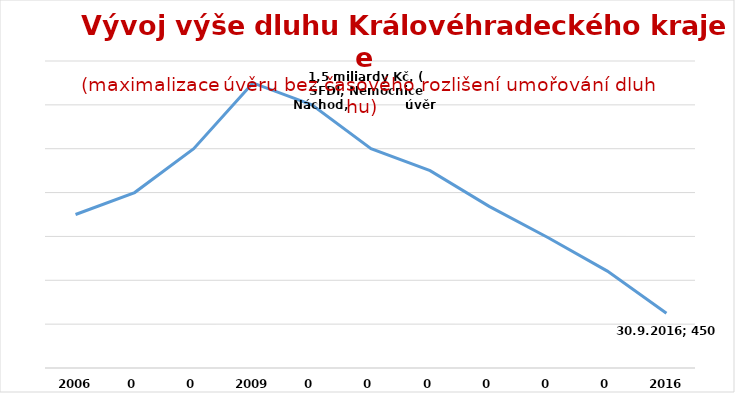
| Category | Series 0 |
|---|---|
| 2006.0 | 900 |
| 0.0 | 1000 |
| 0.0 | 1200 |
| 2009.0 | 1500 |
| 0.0 | 1400 |
| 0.0 | 1200 |
| 0.0 | 1100 |
| 0.0 | 937 |
| 0.0 | 794 |
| 0.0 | 642 |
| 2016.0 | 450 |